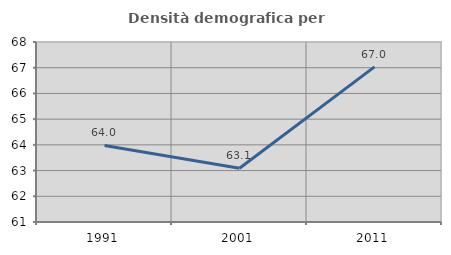
| Category | Densità demografica |
|---|---|
| 1991.0 | 63.976 |
| 2001.0 | 63.089 |
| 2011.0 | 67.032 |